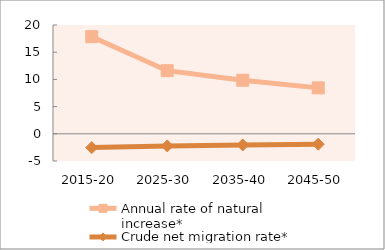
| Category | Annual rate of natural increase* | Crude net migration rate* |
|---|---|---|
| 2015-20 | 17.855 | -2.527 |
| 2025-30 | 11.603 | -2.234 |
| 2035-40 | 9.847 | -2.058 |
| 2045-50 | 8.444 | -1.911 |